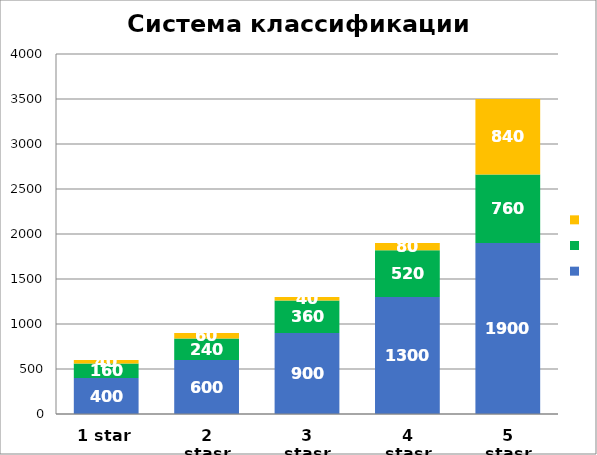
| Category |   |    |                                    |
|---|---|---|---|
| 0 | 400 | 160 | 40 |
| 1 | 600 | 240 | 60 |
| 2 | 900 | 360 | 40 |
| 3 | 1300 | 520 | 80 |
| 4 | 1900 | 760 | 840 |